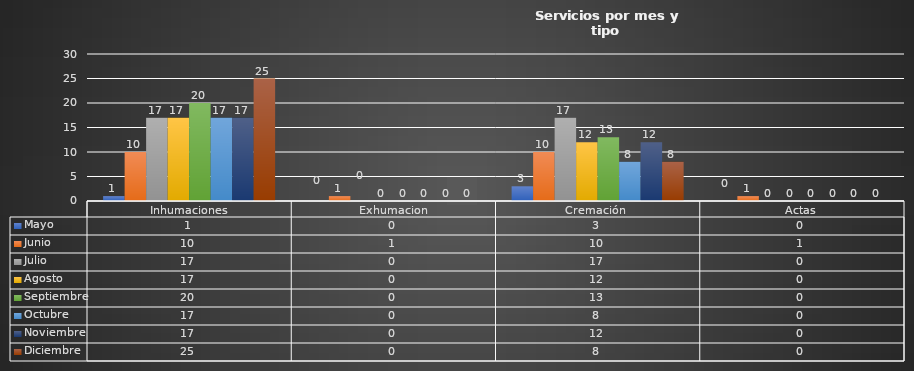
| Category | Mayo  | Junio | Julio | Agosto | Septiembre | Octubre | Noviembre | Diciembre |
|---|---|---|---|---|---|---|---|---|
| Inhumaciones | 1 | 10 | 17 | 17 | 20 | 17 | 17 | 25 |
| Exhumacion | 0 | 1 | 0 | 0 | 0 | 0 | 0 | 0 |
| Cremación  | 3 | 10 | 17 | 12 | 13 | 8 | 12 | 8 |
| Actas | 0 | 1 | 0 | 0 | 0 | 0 | 0 | 0 |